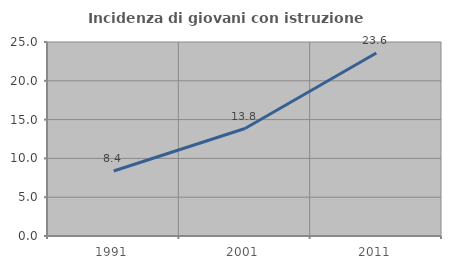
| Category | Incidenza di giovani con istruzione universitaria |
|---|---|
| 1991.0 | 8.377 |
| 2001.0 | 13.849 |
| 2011.0 | 23.581 |